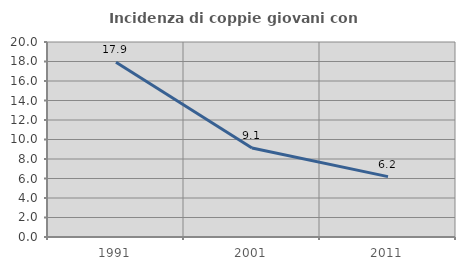
| Category | Incidenza di coppie giovani con figli |
|---|---|
| 1991.0 | 17.922 |
| 2001.0 | 9.135 |
| 2011.0 | 6.189 |